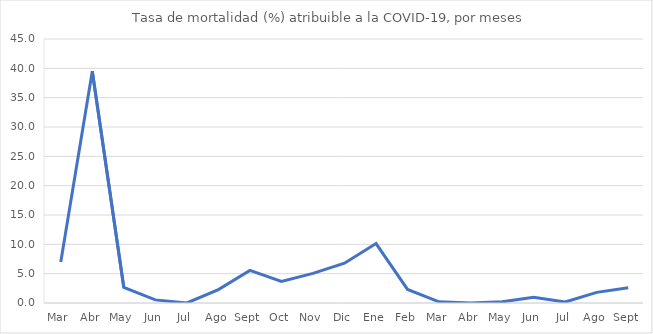
| Category | Series 0 |
|---|---|
| 0 | 6.979 |
| 1 | 39.495 |
| 2 | 2.649 |
| 3 | 0.529 |
| 4 | 0 |
| 5 | 2.28 |
| 6 | 5.547 |
| 7 | 3.659 |
| 8 | 5.042 |
| 9 | 6.79 |
| 10 | 10.136 |
| 11 | 2.31 |
| 12 | 0.205 |
| 13 | 0 |
| 14 | 0.201 |
| 15 | 0.987 |
| 16 | 0.163 |
| 17 | 1.813 |
| 18 | 2.612 |